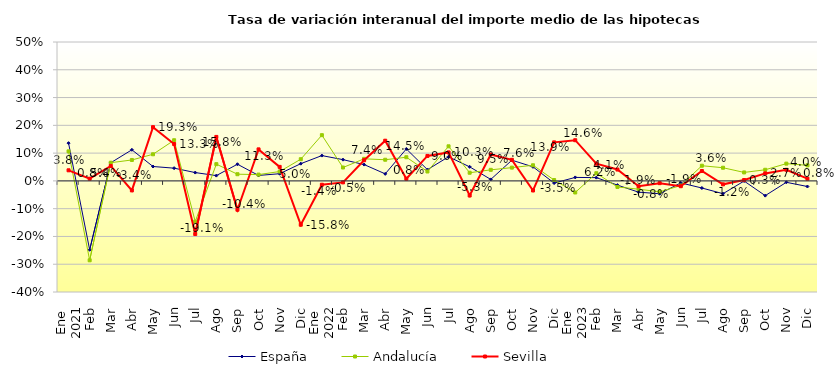
| Category | España | Andalucía | Sevilla |
|---|---|---|---|
| 0 | 0.136 | 0.106 | 0.038 |
| 1 | -0.248 | -0.286 | 0.008 |
| 2 | 0.065 | 0.065 | 0.054 |
| 3 | 0.112 | 0.075 | -0.034 |
| 4 | 0.052 | 0.096 | 0.193 |
| 5 | 0.046 | 0.146 | 0.133 |
| 6 | 0.03 | -0.147 | -0.191 |
| 7 | 0.019 | 0.06 | 0.158 |
| 8 | 0.06 | 0.024 | -0.104 |
| 9 | 0.02 | 0.023 | 0.113 |
| 10 | 0.026 | 0.034 | 0.05 |
| 11 | 0.062 | 0.078 | -0.158 |
| 12 | 0.091 | 0.165 | -0.014 |
| 13 | 0.076 | 0.048 | -0.005 |
| 14 | 0.059 | 0.079 | 0.074 |
| 15 | 0.025 | 0.076 | 0.145 |
| 16 | 0.115 | 0.085 | 0.008 |
| 17 | 0.04 | 0.034 | 0.09 |
| 18 | 0.087 | 0.124 | 0.103 |
| 19 | 0.051 | 0.029 | -0.053 |
| 20 | 0.005 | 0.04 | 0.095 |
| 21 | 0.074 | 0.048 | 0.076 |
| 22 | 0.051 | 0.056 | -0.035 |
| 23 | -0.008 | 0.003 | 0.139 |
| 24 | 0.013 | -0.042 | 0.146 |
| 25 | 0.012 | 0.028 | 0.062 |
| 26 | -0.015 | -0.022 | 0.041 |
| 27 | -0.041 | -0.03 | -0.019 |
| 28 | -0.046 | -0.039 | -0.008 |
| 29 | -0.007 | -0.017 | -0.019 |
| 30 | -0.026 | 0.055 | 0.036 |
| 31 | -0.046 | 0.047 | -0.012 |
| 32 | -0.001 | 0.03 | 0.003 |
| 33 | -0.053 | 0.04 | 0.027 |
| 34 | -0.005 | 0.062 | 0.04 |
| 35 | -0.02 | 0.056 | 0.008 |